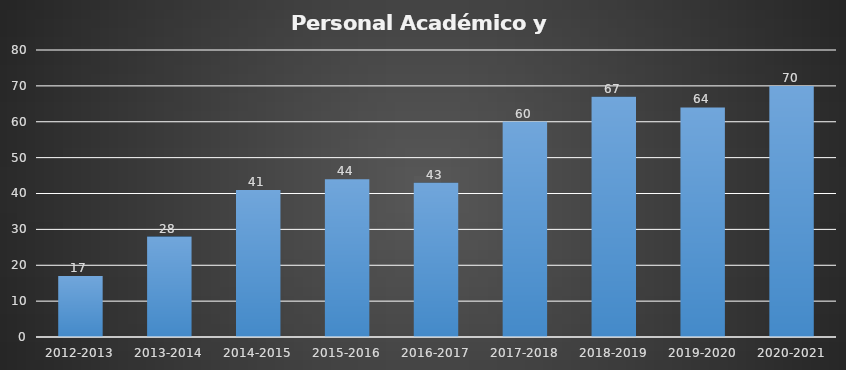
| Category | Series 0 |
|---|---|
| 2012-2013 | 17 |
| 2013-2014 | 28 |
| 2014-2015 | 41 |
| 2015-2016 | 44 |
| 2016-2017 | 43 |
| 2017-2018 | 60 |
| 2018-2019 | 67 |
| 2019-2020 | 64 |
| 2020-2021 | 70 |